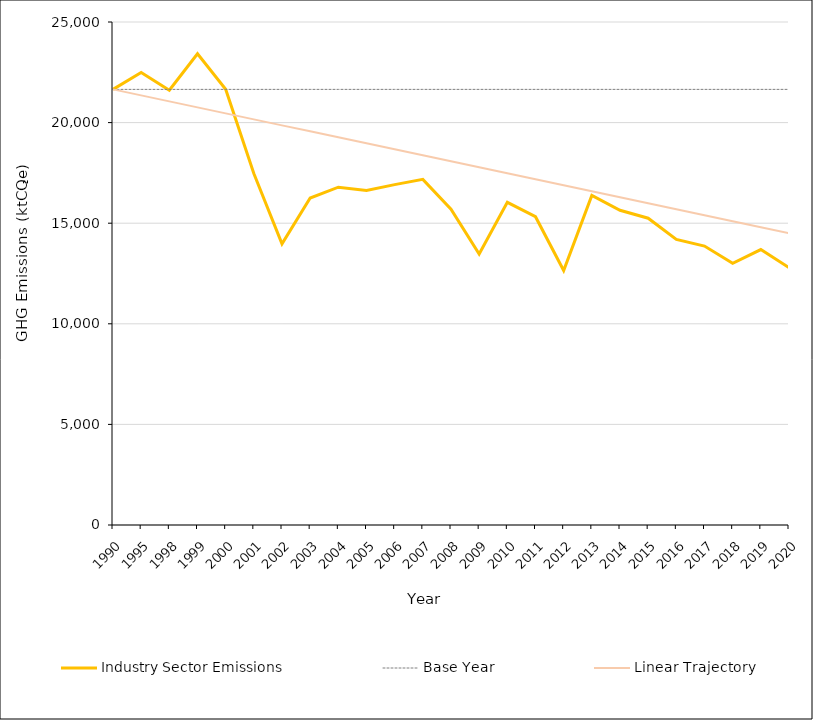
| Category | Industry Sector Emissions | Base Year | CCC's 2020 pathway contribution | Linear Trajectory |
|---|---|---|---|---|
| 1990 | 21651.123 | 21651.123 |  | 21651.123 |
| 1995 | 22485.769 | 21651.123 |  | 21353.13 |
| 1998 | 21609.902 | 21651.123 |  | 21055.137 |
| 1999 | 23421.52 | 21651.123 |  | 20757.144 |
| 2000 | 21659.125 | 21651.123 |  | 20459.151 |
| 2001 | 17472.637 | 21651.123 |  | 20161.159 |
| 2002 | 13972.225 | 21651.123 |  | 19863.166 |
| 2003 | 16248.182 | 21651.123 |  | 19565.173 |
| 2004 | 16788.857 | 21651.123 |  | 19267.18 |
| 2005 | 16622.105 | 21651.123 |  | 18969.187 |
| 2006 | 16917.844 | 21651.123 |  | 18671.194 |
| 2007 | 17178.394 | 21651.123 |  | 18373.201 |
| 2008 | 15699.055 | 21651.123 |  | 18075.208 |
| 2009 | 13469.143 | 21651.123 |  | 17777.215 |
| 2010 | 16036.038 | 21651.123 |  | 17479.222 |
| 2011 | 15323.653 | 21651.123 |  | 17181.229 |
| 2012 | 12648.619 | 21651.123 |  | 16883.237 |
| 2013 | 16380.785 | 21651.123 |  | 16585.244 |
| 2014 | 15641.773 | 21651.123 |  | 16287.251 |
| 2015 | 15248.558 | 21651.123 |  | 15989.258 |
| 2016 | 14193.752 | 21651.123 |  | 15691.265 |
| 2017 | 13863.699 | 21651.123 |  | 15393.272 |
| 2018 | 13005.316 | 21651.123 |  | 15095.279 |
| 2019 | 13688.583 | 21651.123 |  | 14797.286 |
| 2020 | 12791.006 | 21651.123 |  | 14499.293 |